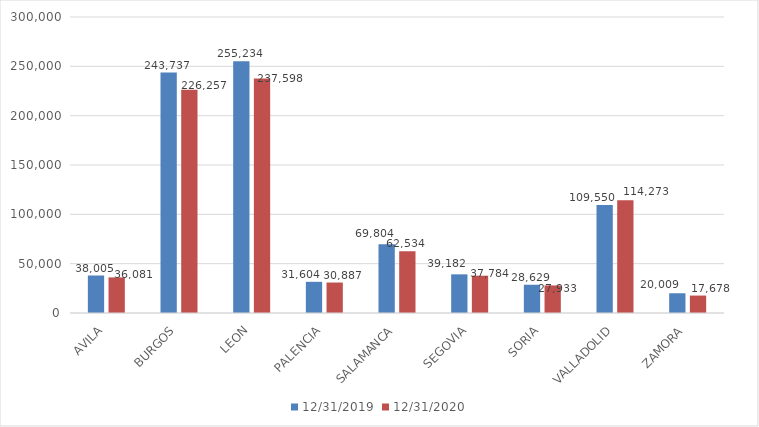
| Category | 31/12/2019 | 31/12/2020 |
|---|---|---|
| AVILA | 38005.005 | 36081.265 |
| BURGOS | 243737.012 | 226256.597 |
| LEON | 255233.746 | 237597.549 |
| PALENCIA | 31603.818 | 30887.232 |
| SALAMANCA | 69804.123 | 62534.378 |
| SEGOVIA | 39182.1 | 37784.325 |
| SORIA | 28628.57 | 27933.091 |
| VALLADOLID | 109550.44 | 114273.442 |
| ZAMORA | 20008.638 | 17677.958 |